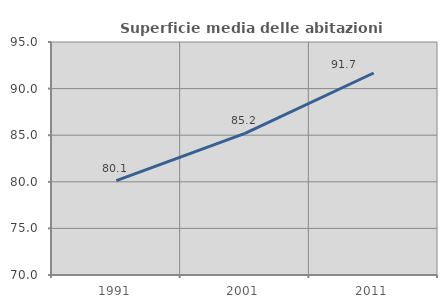
| Category | Superficie media delle abitazioni occupate |
|---|---|
| 1991.0 | 80.122 |
| 2001.0 | 85.199 |
| 2011.0 | 91.674 |